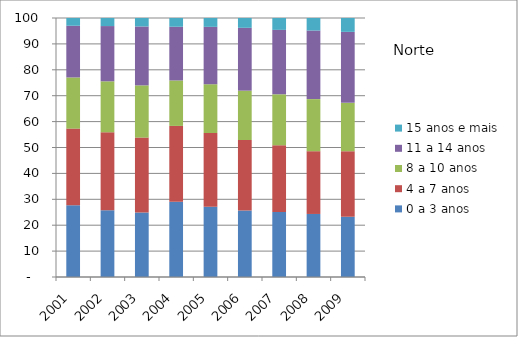
| Category | 0 a 3 anos | 4 a 7 anos | 8 a 10 anos | 11 a 14 anos | 15 anos e mais |
|---|---|---|---|---|---|
| 2001.0 | 27.67 | 29.62 | 19.76 | 19.95 | 3 |
| 2002.0 | 25.82 | 30.06 | 19.68 | 21.33 | 3.1 |
| 2003.0 | 24.86 | 28.97 | 20.16 | 22.74 | 3.28 |
| 2004.0 | 29.01 | 29.32 | 17.56 | 20.73 | 3.38 |
| 2005.0 | 27.11 | 28.49 | 18.83 | 22.15 | 3.43 |
| 2006.0 | 25.72 | 27.18 | 19.05 | 24.26 | 3.8 |
| 2007.0 | 25.1 | 25.76 | 19.68 | 24.88 | 4.58 |
| 2008.0 | 24.34 | 24.23 | 20.11 | 26.48 | 4.85 |
| 2009.0 | 23.24 | 25.33 | 18.66 | 27.41 | 5.37 |